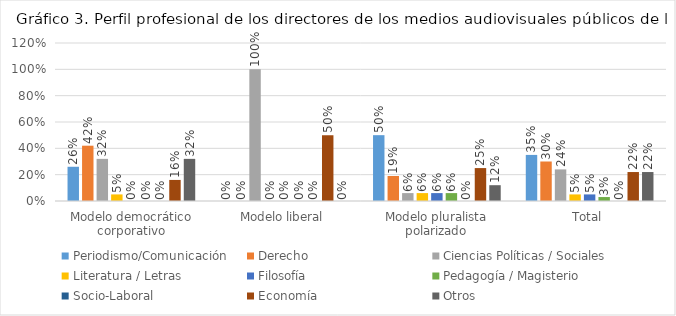
| Category | Periodismo/Comunicación | Derecho | Ciencias Políticas / Sociales | Literatura / Letras | Filosofía | Pedagogía / Magisterio | Socio-Laboral | Economía | Otros |
|---|---|---|---|---|---|---|---|---|---|
| Modelo democrático corporativo | 0.26 | 0.42 | 0.32 | 0.05 | 0 | 0 | 0 | 0.16 | 0.32 |
| Modelo liberal | 0 | 0 | 1 | 0 | 0 | 0 | 0 | 0.5 | 0 |
| Modelo pluralista polarizado | 0.5 | 0.19 | 0.06 | 0.06 | 0.06 | 0.06 | 0 | 0.25 | 0.12 |
| Total | 0.35 | 0.3 | 0.24 | 0.05 | 0.05 | 0.03 | 0 | 0.22 | 0.22 |